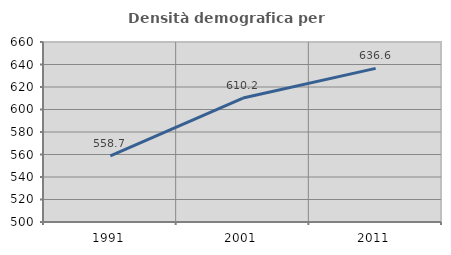
| Category | Densità demografica |
|---|---|
| 1991.0 | 558.735 |
| 2001.0 | 610.17 |
| 2011.0 | 636.562 |